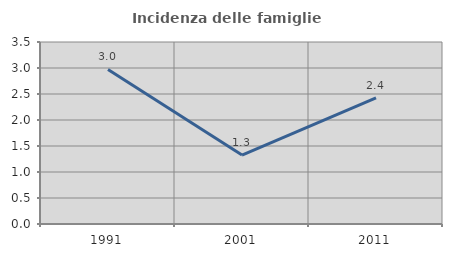
| Category | Incidenza delle famiglie numerose |
|---|---|
| 1991.0 | 2.972 |
| 2001.0 | 1.327 |
| 2011.0 | 2.426 |